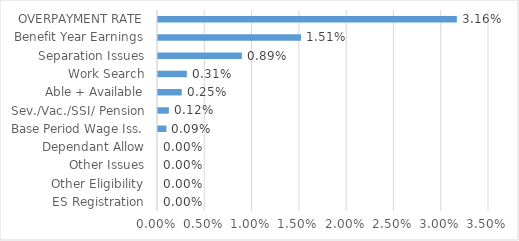
| Category | Series 0 |
|---|---|
| ES Registration | 0 |
| Other Eligibility | 0 |
| Other Issues | 0 |
| Dependant Allow | 0 |
| Base Period Wage Iss. | 0.001 |
| Sev./Vac./SSI/ Pension | 0.001 |
| Able + Available | 0.003 |
| Work Search | 0.003 |
| Separation Issues | 0.009 |
| Benefit Year Earnings | 0.015 |
| OVERPAYMENT RATE | 0.032 |